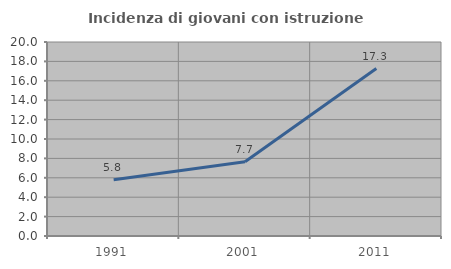
| Category | Incidenza di giovani con istruzione universitaria |
|---|---|
| 1991.0 | 5.797 |
| 2001.0 | 7.658 |
| 2011.0 | 17.262 |